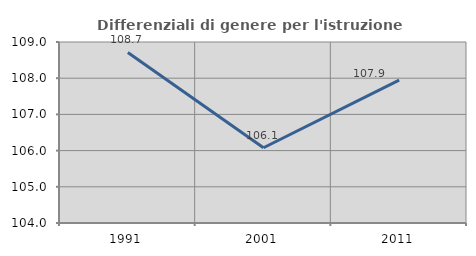
| Category | Differenziali di genere per l'istruzione superiore |
|---|---|
| 1991.0 | 108.712 |
| 2001.0 | 106.079 |
| 2011.0 | 107.945 |